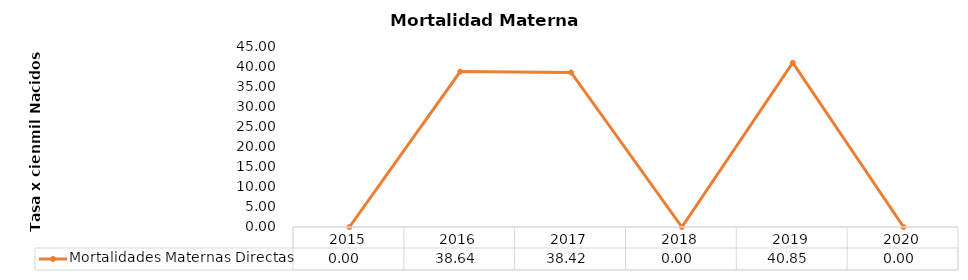
| Category | Mortalidades Maternas Directas |
|---|---|
| 2015.0 | 0 |
| 2016.0 | 38.64 |
| 2017.0 | 38.417 |
| 2018.0 | 0 |
| 2019.0 | 40.85 |
| 2020.0 | 0 |